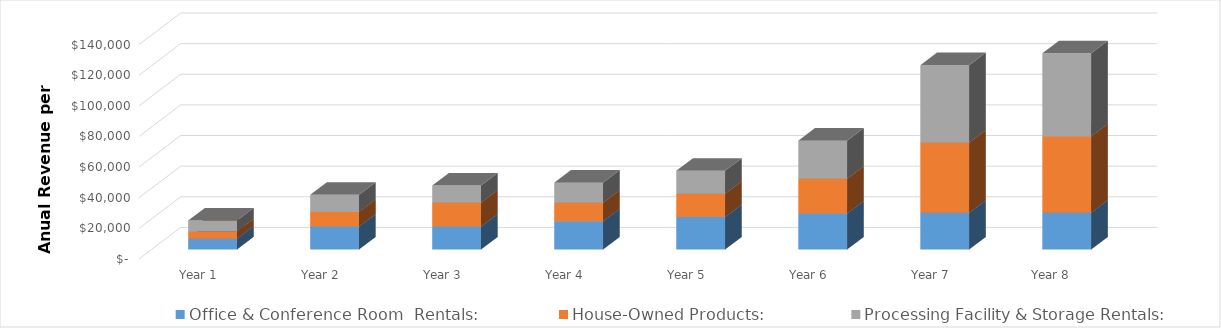
| Category | Office & Conference Room  Rentals: | House-Owned Products:  | Processing Facility & Storage Rentals:  |
|---|---|---|---|
| Year 1 | 7104 | 4800 | 7020 |
| Year 2 | 14976 | 9600 | 11160 |
| Year 3 | 14976 | 15661.154 | 11160 |
| Year 4 | 18432 | 12122.308 | 13080 |
| Year 5 | 21204 | 15256.616 | 14925 |
| Year 6 | 23508 | 22680.088 | 24885 |
| Year 7 | 23976 | 45848.177 | 50520 |
| Year 8  | 24072 | 49848.177 | 54175 |